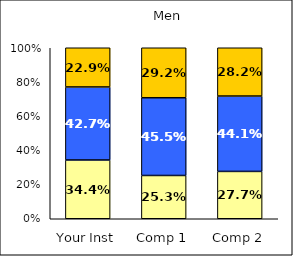
| Category | Low Academic Disengagement | Average Academic Disengagement | High Academic Disengagement |
|---|---|---|---|
| Your Inst | 0.344 | 0.427 | 0.229 |
| Comp 1 | 0.253 | 0.455 | 0.292 |
| Comp 2 | 0.277 | 0.441 | 0.282 |